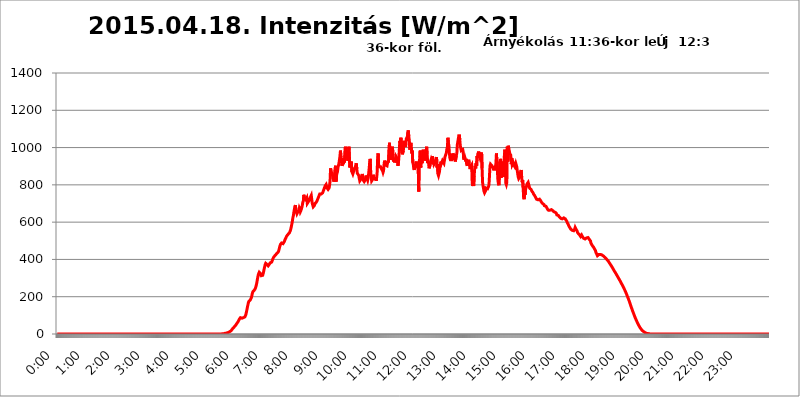
| Category | 2015.04.18. Intenzitás [W/m^2] |
|---|---|
| 0.0 | -0.256 |
| 0.0006944444444444445 | -0.256 |
| 0.001388888888888889 | -0.256 |
| 0.0020833333333333333 | -0.256 |
| 0.002777777777777778 | -0.256 |
| 0.003472222222222222 | -0.256 |
| 0.004166666666666667 | -0.256 |
| 0.004861111111111111 | -0.256 |
| 0.005555555555555556 | -0.256 |
| 0.0062499999999999995 | -0.256 |
| 0.006944444444444444 | -0.256 |
| 0.007638888888888889 | -0.256 |
| 0.008333333333333333 | -0.256 |
| 0.009027777777777779 | -0.256 |
| 0.009722222222222222 | -0.256 |
| 0.010416666666666666 | -0.256 |
| 0.011111111111111112 | -0.256 |
| 0.011805555555555555 | -0.256 |
| 0.012499999999999999 | -0.256 |
| 0.013194444444444444 | -0.256 |
| 0.013888888888888888 | -0.256 |
| 0.014583333333333332 | -0.256 |
| 0.015277777777777777 | -0.256 |
| 0.015972222222222224 | -0.256 |
| 0.016666666666666666 | -0.256 |
| 0.017361111111111112 | -0.256 |
| 0.018055555555555557 | -0.256 |
| 0.01875 | -0.256 |
| 0.019444444444444445 | -0.256 |
| 0.02013888888888889 | -0.256 |
| 0.020833333333333332 | -0.256 |
| 0.02152777777777778 | -0.256 |
| 0.022222222222222223 | -0.256 |
| 0.02291666666666667 | -0.256 |
| 0.02361111111111111 | -0.256 |
| 0.024305555555555556 | -0.256 |
| 0.024999999999999998 | -0.256 |
| 0.025694444444444447 | -0.256 |
| 0.02638888888888889 | -0.256 |
| 0.027083333333333334 | -0.256 |
| 0.027777777777777776 | -0.256 |
| 0.02847222222222222 | -0.256 |
| 0.029166666666666664 | -0.256 |
| 0.029861111111111113 | -0.256 |
| 0.030555555555555555 | -0.256 |
| 0.03125 | -0.256 |
| 0.03194444444444445 | -0.256 |
| 0.03263888888888889 | -0.256 |
| 0.03333333333333333 | -0.256 |
| 0.034027777777777775 | -0.256 |
| 0.034722222222222224 | -0.256 |
| 0.035416666666666666 | -0.256 |
| 0.036111111111111115 | -0.256 |
| 0.03680555555555556 | -0.256 |
| 0.0375 | -0.256 |
| 0.03819444444444444 | -0.256 |
| 0.03888888888888889 | -0.256 |
| 0.03958333333333333 | -0.256 |
| 0.04027777777777778 | -0.256 |
| 0.04097222222222222 | -0.256 |
| 0.041666666666666664 | -0.256 |
| 0.042361111111111106 | -0.256 |
| 0.04305555555555556 | -0.256 |
| 0.043750000000000004 | -0.256 |
| 0.044444444444444446 | -0.256 |
| 0.04513888888888889 | -0.256 |
| 0.04583333333333334 | -0.256 |
| 0.04652777777777778 | -0.256 |
| 0.04722222222222222 | -0.256 |
| 0.04791666666666666 | -0.256 |
| 0.04861111111111111 | -0.256 |
| 0.049305555555555554 | -0.256 |
| 0.049999999999999996 | -0.256 |
| 0.05069444444444445 | -0.256 |
| 0.051388888888888894 | -0.256 |
| 0.052083333333333336 | -0.256 |
| 0.05277777777777778 | -0.256 |
| 0.05347222222222222 | -0.256 |
| 0.05416666666666667 | -0.256 |
| 0.05486111111111111 | -0.256 |
| 0.05555555555555555 | -0.256 |
| 0.05625 | -0.256 |
| 0.05694444444444444 | -0.256 |
| 0.057638888888888885 | -0.256 |
| 0.05833333333333333 | -0.256 |
| 0.05902777777777778 | -0.256 |
| 0.059722222222222225 | -0.256 |
| 0.06041666666666667 | -0.256 |
| 0.061111111111111116 | -0.256 |
| 0.06180555555555556 | -0.256 |
| 0.0625 | -0.256 |
| 0.06319444444444444 | -0.256 |
| 0.06388888888888888 | -0.256 |
| 0.06458333333333334 | -0.256 |
| 0.06527777777777778 | -0.256 |
| 0.06597222222222222 | -0.256 |
| 0.06666666666666667 | -0.256 |
| 0.06736111111111111 | -0.256 |
| 0.06805555555555555 | -0.256 |
| 0.06874999999999999 | -0.256 |
| 0.06944444444444443 | -0.256 |
| 0.07013888888888889 | -0.256 |
| 0.07083333333333333 | -0.256 |
| 0.07152777777777779 | -0.256 |
| 0.07222222222222223 | -0.256 |
| 0.07291666666666667 | -0.256 |
| 0.07361111111111111 | -0.256 |
| 0.07430555555555556 | -0.256 |
| 0.075 | -0.256 |
| 0.07569444444444444 | -0.256 |
| 0.0763888888888889 | -0.256 |
| 0.07708333333333334 | -0.256 |
| 0.07777777777777778 | -0.256 |
| 0.07847222222222222 | -0.256 |
| 0.07916666666666666 | -0.256 |
| 0.0798611111111111 | -0.256 |
| 0.08055555555555556 | -0.256 |
| 0.08125 | -0.256 |
| 0.08194444444444444 | -0.256 |
| 0.08263888888888889 | -0.256 |
| 0.08333333333333333 | -0.256 |
| 0.08402777777777777 | -0.256 |
| 0.08472222222222221 | -0.256 |
| 0.08541666666666665 | -0.256 |
| 0.08611111111111112 | -0.256 |
| 0.08680555555555557 | -0.256 |
| 0.08750000000000001 | -0.256 |
| 0.08819444444444445 | -0.256 |
| 0.08888888888888889 | -0.256 |
| 0.08958333333333333 | -0.256 |
| 0.09027777777777778 | -0.256 |
| 0.09097222222222222 | -0.256 |
| 0.09166666666666667 | -0.256 |
| 0.09236111111111112 | -0.256 |
| 0.09305555555555556 | -0.256 |
| 0.09375 | -0.256 |
| 0.09444444444444444 | -0.256 |
| 0.09513888888888888 | -0.256 |
| 0.09583333333333333 | -0.256 |
| 0.09652777777777777 | -0.256 |
| 0.09722222222222222 | -0.256 |
| 0.09791666666666667 | -0.256 |
| 0.09861111111111111 | -0.256 |
| 0.09930555555555555 | -0.256 |
| 0.09999999999999999 | -0.256 |
| 0.10069444444444443 | -0.256 |
| 0.1013888888888889 | -0.256 |
| 0.10208333333333335 | -0.256 |
| 0.10277777777777779 | -0.256 |
| 0.10347222222222223 | -0.256 |
| 0.10416666666666667 | -0.256 |
| 0.10486111111111111 | -0.256 |
| 0.10555555555555556 | -0.256 |
| 0.10625 | -0.256 |
| 0.10694444444444444 | -0.256 |
| 0.1076388888888889 | -0.256 |
| 0.10833333333333334 | -0.256 |
| 0.10902777777777778 | -0.256 |
| 0.10972222222222222 | -0.256 |
| 0.1111111111111111 | -0.256 |
| 0.11180555555555556 | -0.256 |
| 0.11180555555555556 | -0.256 |
| 0.1125 | -0.256 |
| 0.11319444444444444 | -0.256 |
| 0.11388888888888889 | -0.256 |
| 0.11458333333333333 | -0.256 |
| 0.11527777777777777 | -0.256 |
| 0.11597222222222221 | -0.256 |
| 0.11666666666666665 | -0.256 |
| 0.1173611111111111 | -0.256 |
| 0.11805555555555557 | -0.256 |
| 0.11944444444444445 | -0.256 |
| 0.12013888888888889 | -0.256 |
| 0.12083333333333333 | -0.256 |
| 0.12152777777777778 | -0.256 |
| 0.12222222222222223 | -0.256 |
| 0.12291666666666667 | -0.256 |
| 0.12291666666666667 | -0.256 |
| 0.12361111111111112 | -0.256 |
| 0.12430555555555556 | -0.256 |
| 0.125 | -0.256 |
| 0.12569444444444444 | -0.256 |
| 0.12638888888888888 | -0.256 |
| 0.12708333333333333 | -0.256 |
| 0.16875 | -0.256 |
| 0.12847222222222224 | -0.256 |
| 0.12916666666666668 | -0.256 |
| 0.12986111111111112 | -0.256 |
| 0.13055555555555556 | -0.256 |
| 0.13125 | -0.256 |
| 0.13194444444444445 | -0.256 |
| 0.1326388888888889 | -0.256 |
| 0.13333333333333333 | -0.256 |
| 0.13402777777777777 | -0.256 |
| 0.13402777777777777 | -0.256 |
| 0.13472222222222222 | -0.256 |
| 0.13541666666666666 | -0.256 |
| 0.1361111111111111 | -0.256 |
| 0.13749999999999998 | -0.256 |
| 0.13819444444444443 | -0.256 |
| 0.1388888888888889 | -0.256 |
| 0.13958333333333334 | -0.256 |
| 0.14027777777777778 | -0.256 |
| 0.14097222222222222 | -0.256 |
| 0.14166666666666666 | -0.256 |
| 0.1423611111111111 | -0.256 |
| 0.14305555555555557 | -0.256 |
| 0.14375000000000002 | -0.256 |
| 0.14444444444444446 | -0.256 |
| 0.1451388888888889 | -0.256 |
| 0.1451388888888889 | -0.256 |
| 0.14652777777777778 | -0.256 |
| 0.14722222222222223 | -0.256 |
| 0.14791666666666667 | -0.256 |
| 0.1486111111111111 | -0.256 |
| 0.14930555555555555 | -0.256 |
| 0.15 | -0.256 |
| 0.15069444444444444 | -0.256 |
| 0.15138888888888888 | -0.256 |
| 0.15208333333333332 | -0.256 |
| 0.15277777777777776 | -0.256 |
| 0.15347222222222223 | -0.256 |
| 0.15416666666666667 | -0.256 |
| 0.15486111111111112 | -0.256 |
| 0.15555555555555556 | -0.256 |
| 0.15625 | -0.256 |
| 0.15694444444444444 | -0.256 |
| 0.15763888888888888 | -0.256 |
| 0.15833333333333333 | -0.256 |
| 0.15902777777777777 | -0.256 |
| 0.15972222222222224 | -0.256 |
| 0.16041666666666668 | -0.256 |
| 0.16111111111111112 | -0.256 |
| 0.16180555555555556 | -0.256 |
| 0.1625 | -0.256 |
| 0.16319444444444445 | -0.256 |
| 0.1638888888888889 | -0.256 |
| 0.16458333333333333 | -0.256 |
| 0.16527777777777777 | -0.256 |
| 0.16597222222222222 | -0.256 |
| 0.16666666666666666 | -0.256 |
| 0.1673611111111111 | -0.256 |
| 0.16805555555555554 | -0.256 |
| 0.16874999999999998 | -0.256 |
| 0.16944444444444443 | -0.256 |
| 0.17013888888888887 | -0.256 |
| 0.1708333333333333 | -0.256 |
| 0.17152777777777775 | -0.256 |
| 0.17222222222222225 | -0.256 |
| 0.1729166666666667 | -0.256 |
| 0.17361111111111113 | -0.256 |
| 0.17430555555555557 | -0.256 |
| 0.17500000000000002 | -0.256 |
| 0.17569444444444446 | -0.256 |
| 0.1763888888888889 | -0.256 |
| 0.17708333333333334 | -0.256 |
| 0.17777777777777778 | -0.256 |
| 0.17847222222222223 | -0.256 |
| 0.17916666666666667 | -0.256 |
| 0.1798611111111111 | -0.256 |
| 0.18055555555555555 | -0.256 |
| 0.18125 | -0.256 |
| 0.18194444444444444 | -0.256 |
| 0.1826388888888889 | -0.256 |
| 0.18333333333333335 | -0.256 |
| 0.1840277777777778 | -0.256 |
| 0.18472222222222223 | -0.256 |
| 0.18541666666666667 | -0.256 |
| 0.18611111111111112 | -0.256 |
| 0.18680555555555556 | -0.256 |
| 0.1875 | -0.256 |
| 0.18819444444444444 | -0.256 |
| 0.18888888888888888 | -0.256 |
| 0.18958333333333333 | -0.256 |
| 0.19027777777777777 | -0.256 |
| 0.1909722222222222 | -0.256 |
| 0.19166666666666665 | -0.256 |
| 0.19236111111111112 | -0.256 |
| 0.19305555555555554 | -0.256 |
| 0.19375 | -0.256 |
| 0.19444444444444445 | -0.256 |
| 0.1951388888888889 | -0.256 |
| 0.19583333333333333 | -0.256 |
| 0.19652777777777777 | -0.256 |
| 0.19722222222222222 | -0.256 |
| 0.19791666666666666 | -0.256 |
| 0.1986111111111111 | -0.256 |
| 0.19930555555555554 | -0.256 |
| 0.19999999999999998 | -0.256 |
| 0.20069444444444443 | -0.256 |
| 0.20138888888888887 | -0.256 |
| 0.2020833333333333 | -0.256 |
| 0.2027777777777778 | -0.256 |
| 0.2034722222222222 | -0.256 |
| 0.2041666666666667 | -0.256 |
| 0.20486111111111113 | -0.256 |
| 0.20555555555555557 | -0.256 |
| 0.20625000000000002 | -0.256 |
| 0.20694444444444446 | -0.256 |
| 0.2076388888888889 | -0.256 |
| 0.20833333333333334 | -0.256 |
| 0.20902777777777778 | -0.256 |
| 0.20972222222222223 | -0.256 |
| 0.21041666666666667 | -0.256 |
| 0.2111111111111111 | -0.256 |
| 0.21180555555555555 | -0.256 |
| 0.2125 | -0.256 |
| 0.21319444444444444 | -0.256 |
| 0.2138888888888889 | -0.256 |
| 0.21458333333333335 | -0.256 |
| 0.2152777777777778 | -0.256 |
| 0.21597222222222223 | -0.256 |
| 0.21666666666666667 | -0.256 |
| 0.21736111111111112 | -0.256 |
| 0.21805555555555556 | -0.256 |
| 0.21875 | -0.256 |
| 0.21944444444444444 | -0.256 |
| 0.22013888888888888 | -0.256 |
| 0.22083333333333333 | -0.256 |
| 0.22152777777777777 | -0.256 |
| 0.2222222222222222 | -0.256 |
| 0.22291666666666665 | -0.256 |
| 0.2236111111111111 | -0.256 |
| 0.22430555555555556 | -0.256 |
| 0.225 | -0.256 |
| 0.22569444444444445 | -0.256 |
| 0.2263888888888889 | -0.256 |
| 0.22708333333333333 | -0.256 |
| 0.22777777777777777 | -0.256 |
| 0.22847222222222222 | -0.256 |
| 0.22916666666666666 | -0.256 |
| 0.2298611111111111 | 1.09 |
| 0.23055555555555554 | 1.09 |
| 0.23124999999999998 | 1.09 |
| 0.23194444444444443 | 1.09 |
| 0.23263888888888887 | 1.09 |
| 0.2333333333333333 | 1.09 |
| 0.2340277777777778 | 2.439 |
| 0.2347222222222222 | 2.439 |
| 0.2354166666666667 | 3.791 |
| 0.23611111111111113 | 3.791 |
| 0.23680555555555557 | 5.146 |
| 0.23750000000000002 | 5.146 |
| 0.23819444444444446 | 6.503 |
| 0.2388888888888889 | 6.503 |
| 0.23958333333333334 | 7.862 |
| 0.24027777777777778 | 9.225 |
| 0.24097222222222223 | 10.589 |
| 0.24166666666666667 | 11.956 |
| 0.2423611111111111 | 13.325 |
| 0.24305555555555555 | 14.696 |
| 0.24375 | 17.444 |
| 0.24444444444444446 | 20.201 |
| 0.24513888888888888 | 24.35 |
| 0.24583333333333335 | 27.124 |
| 0.2465277777777778 | 31.297 |
| 0.24722222222222223 | 34.086 |
| 0.24791666666666667 | 36.881 |
| 0.24861111111111112 | 39.68 |
| 0.24930555555555556 | 42.483 |
| 0.25 | 45.29 |
| 0.25069444444444444 | 49.507 |
| 0.2513888888888889 | 53.73 |
| 0.2520833333333333 | 57.958 |
| 0.25277777777777777 | 62.189 |
| 0.2534722222222222 | 65.012 |
| 0.25416666666666665 | 70.658 |
| 0.2548611111111111 | 74.892 |
| 0.2555555555555556 | 80.536 |
| 0.25625000000000003 | 84.766 |
| 0.2569444444444445 | 87.583 |
| 0.2576388888888889 | 87.583 |
| 0.25833333333333336 | 86.175 |
| 0.2590277777777778 | 84.766 |
| 0.25972222222222224 | 84.766 |
| 0.2604166666666667 | 86.175 |
| 0.2611111111111111 | 87.583 |
| 0.26180555555555557 | 88.991 |
| 0.2625 | 90.399 |
| 0.26319444444444445 | 91.806 |
| 0.2638888888888889 | 96.022 |
| 0.26458333333333334 | 104.435 |
| 0.2652777777777778 | 116.989 |
| 0.2659722222222222 | 129.444 |
| 0.26666666666666666 | 143.144 |
| 0.2673611111111111 | 155.333 |
| 0.26805555555555555 | 167.374 |
| 0.26875 | 175.315 |
| 0.26944444444444443 | 180.569 |
| 0.2701388888888889 | 180.569 |
| 0.2708333333333333 | 183.184 |
| 0.27152777777777776 | 187.091 |
| 0.2722222222222222 | 194.849 |
| 0.27291666666666664 | 205.079 |
| 0.2736111111111111 | 217.681 |
| 0.2743055555555555 | 226.383 |
| 0.27499999999999997 | 231.313 |
| 0.27569444444444446 | 232.54 |
| 0.27638888888888885 | 234.99 |
| 0.27708333333333335 | 238.651 |
| 0.2777777777777778 | 244.717 |
| 0.27847222222222223 | 251.939 |
| 0.2791666666666667 | 262.666 |
| 0.2798611111111111 | 274.454 |
| 0.28055555555555556 | 289.616 |
| 0.28125 | 304.664 |
| 0.28194444444444444 | 317.371 |
| 0.2826388888888889 | 325.473 |
| 0.2833333333333333 | 331.279 |
| 0.28402777777777777 | 330.117 |
| 0.2847222222222222 | 325.473 |
| 0.28541666666666665 | 318.527 |
| 0.28611111111111115 | 312.749 |
| 0.28680555555555554 | 309.284 |
| 0.28750000000000003 | 310.439 |
| 0.2881944444444445 | 315.059 |
| 0.2888888888888889 | 325.473 |
| 0.28958333333333336 | 337.109 |
| 0.2902777777777778 | 350.049 |
| 0.29097222222222224 | 362.004 |
| 0.2916666666666667 | 372.972 |
| 0.2923611111111111 | 379.171 |
| 0.29305555555555557 | 380.42 |
| 0.29375 | 377.925 |
| 0.29444444444444445 | 371.742 |
| 0.2951388888888889 | 366.851 |
| 0.29583333333333334 | 365.635 |
| 0.2965277777777778 | 366.851 |
| 0.2972222222222222 | 372.972 |
| 0.29791666666666666 | 377.925 |
| 0.2986111111111111 | 381.674 |
| 0.29930555555555555 | 381.674 |
| 0.3 | 382.93 |
| 0.30069444444444443 | 385.455 |
| 0.3013888888888889 | 391.834 |
| 0.3020833333333333 | 399.628 |
| 0.30277777777777776 | 406.25 |
| 0.3034722222222222 | 411.638 |
| 0.30416666666666664 | 415.735 |
| 0.3048611111111111 | 418.495 |
| 0.3055555555555555 | 421.278 |
| 0.30624999999999997 | 424.085 |
| 0.3069444444444444 | 426.916 |
| 0.3076388888888889 | 431.211 |
| 0.30833333333333335 | 434.107 |
| 0.3090277777777778 | 435.566 |
| 0.30972222222222223 | 438.503 |
| 0.3104166666666667 | 444.463 |
| 0.3111111111111111 | 453.629 |
| 0.31180555555555556 | 464.688 |
| 0.3125 | 474.507 |
| 0.31319444444444444 | 481.238 |
| 0.3138888888888889 | 486.389 |
| 0.3145833333333333 | 488.126 |
| 0.31527777777777777 | 486.389 |
| 0.3159722222222222 | 484.662 |
| 0.31666666666666665 | 484.662 |
| 0.31736111111111115 | 488.126 |
| 0.31805555555555554 | 493.398 |
| 0.31875000000000003 | 498.764 |
| 0.3194444444444445 | 506.072 |
| 0.3201388888888889 | 511.671 |
| 0.32083333333333336 | 517.375 |
| 0.3215277777777778 | 523.186 |
| 0.32222222222222224 | 527.122 |
| 0.3229166666666667 | 531.108 |
| 0.3236111111111111 | 535.145 |
| 0.32430555555555557 | 537.182 |
| 0.325 | 539.234 |
| 0.32569444444444445 | 543.376 |
| 0.3263888888888889 | 549.691 |
| 0.32708333333333334 | 556.131 |
| 0.3277777777777778 | 567.15 |
| 0.3284722222222222 | 578.542 |
| 0.32916666666666666 | 592.725 |
| 0.3298611111111111 | 607.495 |
| 0.33055555555555555 | 625.508 |
| 0.33125 | 636.194 |
| 0.33194444444444443 | 655.618 |
| 0.3326388888888889 | 670.078 |
| 0.3333333333333333 | 685.046 |
| 0.3340277777777778 | 691.18 |
| 0.3347222222222222 | 661.343 |
| 0.3354166666666667 | 652.786 |
| 0.3361111111111111 | 644.405 |
| 0.3368055555555556 | 649.973 |
| 0.33749999999999997 | 655.618 |
| 0.33819444444444446 | 655.618 |
| 0.33888888888888885 | 661.343 |
| 0.33958333333333335 | 676.003 |
| 0.34027777777777773 | 670.078 |
| 0.34097222222222223 | 655.618 |
| 0.3416666666666666 | 661.343 |
| 0.3423611111111111 | 664.234 |
| 0.3430555555555555 | 678.997 |
| 0.34375 | 691.18 |
| 0.3444444444444445 | 706.89 |
| 0.3451388888888889 | 713.328 |
| 0.3458333333333334 | 746.886 |
| 0.34652777777777777 | 729.817 |
| 0.34722222222222227 | 729.817 |
| 0.34791666666666665 | 726.474 |
| 0.34861111111111115 | 719.855 |
| 0.34930555555555554 | 719.855 |
| 0.35000000000000003 | 729.817 |
| 0.3506944444444444 | 700.54 |
| 0.3513888888888889 | 697.399 |
| 0.3520833333333333 | 700.54 |
| 0.3527777777777778 | 713.328 |
| 0.3534722222222222 | 719.855 |
| 0.3541666666666667 | 726.474 |
| 0.3548611111111111 | 726.474 |
| 0.35555555555555557 | 726.474 |
| 0.35625 | 743.425 |
| 0.35694444444444445 | 723.153 |
| 0.3576388888888889 | 700.54 |
| 0.35833333333333334 | 691.18 |
| 0.3590277777777778 | 682.011 |
| 0.3597222222222222 | 682.011 |
| 0.36041666666666666 | 688.102 |
| 0.3611111111111111 | 694.278 |
| 0.36180555555555555 | 700.54 |
| 0.3625 | 700.54 |
| 0.36319444444444443 | 703.704 |
| 0.3638888888888889 | 710.098 |
| 0.3645833333333333 | 713.328 |
| 0.3652777777777778 | 723.153 |
| 0.3659722222222222 | 729.817 |
| 0.3666666666666667 | 736.574 |
| 0.3673611111111111 | 743.425 |
| 0.3680555555555556 | 750.371 |
| 0.36874999999999997 | 750.371 |
| 0.36944444444444446 | 746.886 |
| 0.37013888888888885 | 750.371 |
| 0.37083333333333335 | 750.371 |
| 0.37152777777777773 | 753.881 |
| 0.37222222222222223 | 757.414 |
| 0.3729166666666666 | 764.555 |
| 0.3736111111111111 | 771.794 |
| 0.3743055555555555 | 775.451 |
| 0.375 | 786.575 |
| 0.3756944444444445 | 794.119 |
| 0.3763888888888889 | 797.931 |
| 0.3770833333333334 | 801.768 |
| 0.37777777777777777 | 797.931 |
| 0.37847222222222227 | 782.842 |
| 0.37916666666666665 | 779.134 |
| 0.37986111111111115 | 775.451 |
| 0.38055555555555554 | 775.451 |
| 0.38125000000000003 | 782.842 |
| 0.3819444444444444 | 797.931 |
| 0.3826388888888889 | 821.353 |
| 0.3833333333333333 | 888.701 |
| 0.3840277777777778 | 875.511 |
| 0.3847222222222222 | 875.511 |
| 0.3854166666666667 | 858.335 |
| 0.3861111111111111 | 849.92 |
| 0.38680555555555557 | 837.51 |
| 0.3875 | 825.351 |
| 0.38819444444444445 | 817.382 |
| 0.3888888888888889 | 813.439 |
| 0.38958333333333334 | 821.353 |
| 0.3902777777777778 | 902.16 |
| 0.3909722222222222 | 817.382 |
| 0.39166666666666666 | 849.92 |
| 0.3923611111111111 | 862.585 |
| 0.39305555555555555 | 871.173 |
| 0.39375 | 893.157 |
| 0.39444444444444443 | 893.157 |
| 0.3951388888888889 | 915.893 |
| 0.3958333333333333 | 920.533 |
| 0.3965277777777778 | 953.892 |
| 0.3972222222222222 | 983.747 |
| 0.3979166666666667 | 949.03 |
| 0.3986111111111111 | 944.201 |
| 0.3993055555555556 | 902.16 |
| 0.39999999999999997 | 902.16 |
| 0.40069444444444446 | 920.533 |
| 0.40138888888888885 | 911.285 |
| 0.40208333333333335 | 944.201 |
| 0.40277777777777773 | 920.533 |
| 0.40347222222222223 | 925.203 |
| 0.4041666666666666 | 1004.318 |
| 0.4048611111111111 | 953.892 |
| 0.4055555555555555 | 968.671 |
| 0.40625 | 944.201 |
| 0.4069444444444445 | 953.892 |
| 0.4076388888888889 | 929.905 |
| 0.4083333333333334 | 934.639 |
| 0.40902777777777777 | 1004.318 |
| 0.40972222222222227 | 1004.318 |
| 0.41041666666666665 | 893.157 |
| 0.41111111111111115 | 897.643 |
| 0.41180555555555554 | 911.285 |
| 0.41250000000000003 | 925.203 |
| 0.4131944444444444 | 871.173 |
| 0.4138888888888889 | 871.173 |
| 0.4145833333333333 | 858.335 |
| 0.4152777777777778 | 858.335 |
| 0.4159722222222222 | 875.511 |
| 0.4166666666666667 | 879.878 |
| 0.4173611111111111 | 888.701 |
| 0.41805555555555557 | 893.157 |
| 0.41875 | 906.707 |
| 0.41944444444444445 | 915.893 |
| 0.4201388888888889 | 884.274 |
| 0.42083333333333334 | 862.585 |
| 0.4215277777777778 | 866.865 |
| 0.4222222222222222 | 862.585 |
| 0.42291666666666666 | 849.92 |
| 0.4236111111111111 | 833.43 |
| 0.42430555555555555 | 821.353 |
| 0.425 | 817.382 |
| 0.42569444444444443 | 821.353 |
| 0.4263888888888889 | 833.43 |
| 0.4270833333333333 | 837.51 |
| 0.4277777777777778 | 858.335 |
| 0.4284722222222222 | 845.755 |
| 0.4291666666666667 | 825.351 |
| 0.4298611111111111 | 821.353 |
| 0.4305555555555556 | 817.382 |
| 0.43124999999999997 | 817.382 |
| 0.43194444444444446 | 825.351 |
| 0.43263888888888885 | 833.43 |
| 0.43333333333333335 | 849.92 |
| 0.43402777777777773 | 825.351 |
| 0.43472222222222223 | 833.43 |
| 0.4354166666666666 | 825.351 |
| 0.4361111111111111 | 837.51 |
| 0.4368055555555555 | 862.585 |
| 0.4375 | 888.701 |
| 0.4381944444444445 | 920.533 |
| 0.4388888888888889 | 939.404 |
| 0.4395833333333334 | 871.173 |
| 0.44027777777777777 | 841.619 |
| 0.44097222222222227 | 821.353 |
| 0.44166666666666665 | 817.382 |
| 0.44236111111111115 | 829.377 |
| 0.44305555555555554 | 854.113 |
| 0.44375000000000003 | 841.619 |
| 0.4444444444444444 | 833.43 |
| 0.4451388888888889 | 833.43 |
| 0.4458333333333333 | 837.51 |
| 0.4465277777777778 | 833.43 |
| 0.4472222222222222 | 821.353 |
| 0.4479166666666667 | 837.51 |
| 0.4486111111111111 | 862.585 |
| 0.44930555555555557 | 934.639 |
| 0.45 | 968.671 |
| 0.45069444444444445 | 911.285 |
| 0.4513888888888889 | 897.643 |
| 0.45208333333333334 | 897.643 |
| 0.4527777777777778 | 897.643 |
| 0.4534722222222222 | 897.643 |
| 0.45416666666666666 | 893.157 |
| 0.4548611111111111 | 884.274 |
| 0.45555555555555555 | 879.878 |
| 0.45625 | 875.511 |
| 0.45694444444444443 | 866.865 |
| 0.4576388888888889 | 875.511 |
| 0.4583333333333333 | 906.707 |
| 0.4590277777777778 | 929.905 |
| 0.4597222222222222 | 925.203 |
| 0.4604166666666667 | 906.707 |
| 0.4611111111111111 | 906.707 |
| 0.4618055555555556 | 911.285 |
| 0.46249999999999997 | 902.16 |
| 0.46319444444444446 | 897.643 |
| 0.46388888888888885 | 929.905 |
| 0.46458333333333335 | 920.533 |
| 0.46527777777777773 | 920.533 |
| 0.46597222222222223 | 1025.437 |
| 0.4666666666666666 | 968.671 |
| 0.4673611111111111 | 983.747 |
| 0.4680555555555555 | 934.639 |
| 0.46875 | 973.663 |
| 0.4694444444444445 | 953.892 |
| 0.4701388888888889 | 1004.318 |
| 0.4708333333333334 | 958.785 |
| 0.47152777777777777 | 925.203 |
| 0.47222222222222227 | 939.404 |
| 0.47291666666666665 | 920.533 |
| 0.47361111111111115 | 915.893 |
| 0.47430555555555554 | 939.404 |
| 0.47500000000000003 | 953.892 |
| 0.4756944444444444 | 958.785 |
| 0.4763888888888889 | 944.201 |
| 0.4770833333333333 | 929.905 |
| 0.4777777777777778 | 902.16 |
| 0.4784722222222222 | 915.893 |
| 0.4791666666666667 | 949.03 |
| 0.4798611111111111 | 993.965 |
| 0.48055555555555557 | 1036.206 |
| 0.48125 | 1014.809 |
| 0.48194444444444445 | 1052.625 |
| 0.4826388888888889 | 993.965 |
| 0.48333333333333334 | 973.663 |
| 0.4840277777777778 | 963.712 |
| 0.4847222222222222 | 963.712 |
| 0.48541666666666666 | 983.747 |
| 0.4861111111111111 | 1036.206 |
| 0.48680555555555555 | 1009.546 |
| 0.4875 | 1004.318 |
| 0.48819444444444443 | 1009.546 |
| 0.4888888888888889 | 1009.546 |
| 0.4895833333333333 | 1047.117 |
| 0.4902777777777778 | 1052.625 |
| 0.4909722222222222 | 1036.206 |
| 0.4916666666666667 | 1080.711 |
| 0.4923611111111111 | 1092.203 |
| 0.4930555555555556 | 1058.17 |
| 0.49374999999999997 | 1041.644 |
| 0.49444444444444446 | 988.839 |
| 0.49513888888888885 | 988.839 |
| 0.49583333333333335 | 1025.437 |
| 0.49652777777777773 | 1009.546 |
| 0.49722222222222223 | 968.671 |
| 0.4979166666666666 | 983.747 |
| 0.4986111111111111 | 920.533 |
| 0.4993055555555555 | 911.285 |
| 0.5 | 888.701 |
| 0.5006944444444444 | 879.878 |
| 0.5013888888888889 | 902.16 |
| 0.5020833333333333 | 902.16 |
| 0.5027777777777778 | 911.285 |
| 0.5034722222222222 | 925.203 |
| 0.5041666666666667 | 902.16 |
| 0.5048611111111111 | 897.643 |
| 0.5055555555555555 | 893.157 |
| 0.50625 | 911.285 |
| 0.5069444444444444 | 764.555 |
| 0.5076388888888889 | 925.203 |
| 0.5083333333333333 | 939.404 |
| 0.5090277777777777 | 983.747 |
| 0.5097222222222222 | 893.157 |
| 0.5104166666666666 | 934.639 |
| 0.5111111111111112 | 925.203 |
| 0.5118055555555555 | 915.893 |
| 0.5125000000000001 | 958.785 |
| 0.5131944444444444 | 988.839 |
| 0.513888888888889 | 963.712 |
| 0.5145833333333333 | 963.712 |
| 0.5152777777777778 | 939.404 |
| 0.5159722222222222 | 929.905 |
| 0.5166666666666667 | 925.203 |
| 0.517361111111111 | 934.639 |
| 0.5180555555555556 | 1004.318 |
| 0.5187499999999999 | 963.712 |
| 0.5194444444444445 | 915.893 |
| 0.5201388888888888 | 925.203 |
| 0.5208333333333334 | 915.893 |
| 0.5215277777777778 | 888.701 |
| 0.5222222222222223 | 888.701 |
| 0.5229166666666667 | 906.707 |
| 0.5236111111111111 | 925.203 |
| 0.5243055555555556 | 934.639 |
| 0.525 | 925.203 |
| 0.5256944444444445 | 911.285 |
| 0.5263888888888889 | 953.892 |
| 0.5270833333333333 | 911.285 |
| 0.5277777777777778 | 934.639 |
| 0.5284722222222222 | 911.285 |
| 0.5291666666666667 | 911.285 |
| 0.5298611111111111 | 915.893 |
| 0.5305555555555556 | 925.203 |
| 0.53125 | 925.203 |
| 0.5319444444444444 | 949.03 |
| 0.5326388888888889 | 893.157 |
| 0.5333333333333333 | 911.285 |
| 0.5340277777777778 | 858.335 |
| 0.5347222222222222 | 849.92 |
| 0.5354166666666667 | 849.92 |
| 0.5361111111111111 | 871.173 |
| 0.5368055555555555 | 897.643 |
| 0.5375 | 902.16 |
| 0.5381944444444444 | 925.203 |
| 0.5388888888888889 | 915.893 |
| 0.5395833333333333 | 911.285 |
| 0.5402777777777777 | 929.905 |
| 0.5409722222222222 | 925.203 |
| 0.5416666666666666 | 925.203 |
| 0.5423611111111112 | 915.893 |
| 0.5430555555555555 | 911.285 |
| 0.5437500000000001 | 949.03 |
| 0.5444444444444444 | 944.201 |
| 0.545138888888889 | 949.03 |
| 0.5458333333333333 | 973.663 |
| 0.5465277777777778 | 993.965 |
| 0.5472222222222222 | 1004.318 |
| 0.5479166666666667 | 1052.625 |
| 0.548611111111111 | 1025.437 |
| 0.5493055555555556 | 1009.546 |
| 0.5499999999999999 | 968.671 |
| 0.5506944444444445 | 944.201 |
| 0.5513888888888888 | 934.639 |
| 0.5520833333333334 | 934.639 |
| 0.5527777777777778 | 934.639 |
| 0.5534722222222223 | 934.639 |
| 0.5541666666666667 | 958.785 |
| 0.5548611111111111 | 968.671 |
| 0.5555555555555556 | 953.892 |
| 0.55625 | 934.639 |
| 0.5569444444444445 | 944.201 |
| 0.5576388888888889 | 939.404 |
| 0.5583333333333333 | 925.203 |
| 0.5590277777777778 | 925.203 |
| 0.5597222222222222 | 958.785 |
| 0.5604166666666667 | 968.671 |
| 0.5611111111111111 | 1014.809 |
| 0.5618055555555556 | 1020.106 |
| 0.5625 | 1047.117 |
| 0.5631944444444444 | 1041.644 |
| 0.5638888888888889 | 1069.368 |
| 0.5645833333333333 | 1041.644 |
| 0.5652777777777778 | 1009.546 |
| 0.5659722222222222 | 1009.546 |
| 0.5666666666666667 | 983.747 |
| 0.5673611111111111 | 983.747 |
| 0.5680555555555555 | 983.747 |
| 0.56875 | 988.839 |
| 0.5694444444444444 | 973.663 |
| 0.5701388888888889 | 934.639 |
| 0.5708333333333333 | 939.404 |
| 0.5715277777777777 | 949.03 |
| 0.5722222222222222 | 939.404 |
| 0.5729166666666666 | 925.203 |
| 0.5736111111111112 | 939.404 |
| 0.5743055555555555 | 911.285 |
| 0.5750000000000001 | 902.16 |
| 0.5756944444444444 | 920.533 |
| 0.576388888888889 | 920.533 |
| 0.5770833333333333 | 934.639 |
| 0.5777777777777778 | 915.893 |
| 0.5784722222222222 | 897.643 |
| 0.5791666666666667 | 884.274 |
| 0.579861111111111 | 897.643 |
| 0.5805555555555556 | 902.16 |
| 0.5812499999999999 | 906.707 |
| 0.5819444444444445 | 813.439 |
| 0.5826388888888888 | 794.119 |
| 0.5833333333333334 | 809.522 |
| 0.5840277777777778 | 794.119 |
| 0.5847222222222223 | 845.755 |
| 0.5854166666666667 | 884.274 |
| 0.5861111111111111 | 902.16 |
| 0.5868055555555556 | 888.701 |
| 0.5875 | 915.893 |
| 0.5881944444444445 | 902.16 |
| 0.5888888888888889 | 953.892 |
| 0.5895833333333333 | 944.201 |
| 0.5902777777777778 | 968.671 |
| 0.5909722222222222 | 978.688 |
| 0.5916666666666667 | 978.688 |
| 0.5923611111111111 | 953.892 |
| 0.5930555555555556 | 944.201 |
| 0.59375 | 944.201 |
| 0.5944444444444444 | 963.712 |
| 0.5951388888888889 | 973.663 |
| 0.5958333333333333 | 888.701 |
| 0.5965277777777778 | 813.439 |
| 0.5972222222222222 | 794.119 |
| 0.5979166666666667 | 779.134 |
| 0.5986111111111111 | 764.555 |
| 0.5993055555555555 | 757.414 |
| 0.6 | 760.972 |
| 0.6006944444444444 | 768.162 |
| 0.6013888888888889 | 782.842 |
| 0.6020833333333333 | 779.134 |
| 0.6027777777777777 | 779.134 |
| 0.6034722222222222 | 779.134 |
| 0.6041666666666666 | 779.134 |
| 0.6048611111111112 | 790.334 |
| 0.6055555555555555 | 801.768 |
| 0.6062500000000001 | 849.92 |
| 0.6069444444444444 | 902.16 |
| 0.607638888888889 | 911.285 |
| 0.6083333333333333 | 915.893 |
| 0.6090277777777778 | 906.707 |
| 0.6097222222222222 | 902.16 |
| 0.6104166666666667 | 906.707 |
| 0.611111111111111 | 893.157 |
| 0.6118055555555556 | 884.274 |
| 0.6124999999999999 | 879.878 |
| 0.6131944444444445 | 884.274 |
| 0.6138888888888888 | 884.274 |
| 0.6145833333333334 | 897.643 |
| 0.6152777777777778 | 915.893 |
| 0.6159722222222223 | 968.671 |
| 0.6166666666666667 | 920.533 |
| 0.6173611111111111 | 925.203 |
| 0.6180555555555556 | 825.351 |
| 0.61875 | 805.632 |
| 0.6194444444444445 | 797.931 |
| 0.6201388888888889 | 801.768 |
| 0.6208333333333333 | 925.203 |
| 0.6215277777777778 | 939.404 |
| 0.6222222222222222 | 837.51 |
| 0.6229166666666667 | 833.43 |
| 0.6236111111111111 | 902.16 |
| 0.6243055555555556 | 925.203 |
| 0.625 | 858.335 |
| 0.6256944444444444 | 841.619 |
| 0.6263888888888889 | 915.893 |
| 0.6270833333333333 | 953.892 |
| 0.6277777777777778 | 988.839 |
| 0.6284722222222222 | 968.671 |
| 0.6291666666666667 | 809.522 |
| 0.6298611111111111 | 801.768 |
| 0.6305555555555555 | 813.439 |
| 0.63125 | 1004.318 |
| 0.6319444444444444 | 925.203 |
| 0.6326388888888889 | 1009.546 |
| 0.6333333333333333 | 993.965 |
| 0.6340277777777777 | 993.965 |
| 0.6347222222222222 | 968.671 |
| 0.6354166666666666 | 963.712 |
| 0.6361111111111112 | 958.785 |
| 0.6368055555555555 | 911.285 |
| 0.6375000000000001 | 944.201 |
| 0.6381944444444444 | 906.707 |
| 0.638888888888889 | 906.707 |
| 0.6395833333333333 | 915.893 |
| 0.6402777777777778 | 906.707 |
| 0.6409722222222222 | 906.707 |
| 0.6416666666666667 | 897.643 |
| 0.642361111111111 | 893.157 |
| 0.6430555555555556 | 915.893 |
| 0.6437499999999999 | 915.893 |
| 0.6444444444444445 | 897.643 |
| 0.6451388888888888 | 893.157 |
| 0.6458333333333334 | 858.335 |
| 0.6465277777777778 | 841.619 |
| 0.6472222222222223 | 833.43 |
| 0.6479166666666667 | 833.43 |
| 0.6486111111111111 | 841.619 |
| 0.6493055555555556 | 845.755 |
| 0.65 | 871.173 |
| 0.6506944444444445 | 879.878 |
| 0.6513888888888889 | 841.619 |
| 0.6520833333333333 | 813.439 |
| 0.6527777777777778 | 825.351 |
| 0.6534722222222222 | 782.842 |
| 0.6541666666666667 | 729.817 |
| 0.6548611111111111 | 723.153 |
| 0.6555555555555556 | 757.414 |
| 0.65625 | 746.886 |
| 0.6569444444444444 | 794.119 |
| 0.6576388888888889 | 786.575 |
| 0.6583333333333333 | 782.842 |
| 0.6590277777777778 | 805.632 |
| 0.6597222222222222 | 809.522 |
| 0.6604166666666667 | 813.439 |
| 0.6611111111111111 | 809.522 |
| 0.6618055555555555 | 794.119 |
| 0.6625 | 782.842 |
| 0.6631944444444444 | 782.842 |
| 0.6638888888888889 | 779.134 |
| 0.6645833333333333 | 775.451 |
| 0.6652777777777777 | 771.794 |
| 0.6659722222222222 | 764.555 |
| 0.6666666666666666 | 760.972 |
| 0.6673611111111111 | 757.414 |
| 0.6680555555555556 | 750.371 |
| 0.6687500000000001 | 750.371 |
| 0.6694444444444444 | 743.425 |
| 0.6701388888888888 | 739.988 |
| 0.6708333333333334 | 733.184 |
| 0.6715277777777778 | 729.817 |
| 0.6722222222222222 | 723.153 |
| 0.6729166666666666 | 719.855 |
| 0.6736111111111112 | 719.855 |
| 0.6743055555555556 | 719.855 |
| 0.6749999999999999 | 723.153 |
| 0.6756944444444444 | 723.153 |
| 0.6763888888888889 | 723.153 |
| 0.6770833333333334 | 719.855 |
| 0.6777777777777777 | 716.58 |
| 0.6784722222222223 | 713.328 |
| 0.6791666666666667 | 706.89 |
| 0.6798611111111111 | 703.704 |
| 0.6805555555555555 | 700.54 |
| 0.68125 | 700.54 |
| 0.6819444444444445 | 697.399 |
| 0.6826388888888889 | 694.278 |
| 0.6833333333333332 | 688.102 |
| 0.6840277777777778 | 688.102 |
| 0.6847222222222222 | 688.102 |
| 0.6854166666666667 | 685.046 |
| 0.686111111111111 | 682.011 |
| 0.6868055555555556 | 676.003 |
| 0.6875 | 670.078 |
| 0.6881944444444444 | 670.078 |
| 0.688888888888889 | 664.234 |
| 0.6895833333333333 | 664.234 |
| 0.6902777777777778 | 664.234 |
| 0.6909722222222222 | 664.234 |
| 0.6916666666666668 | 664.234 |
| 0.6923611111111111 | 667.146 |
| 0.6930555555555555 | 667.146 |
| 0.69375 | 664.234 |
| 0.6944444444444445 | 664.234 |
| 0.6951388888888889 | 661.343 |
| 0.6958333333333333 | 658.471 |
| 0.6965277777777777 | 655.618 |
| 0.6972222222222223 | 652.786 |
| 0.6979166666666666 | 652.786 |
| 0.6986111111111111 | 652.786 |
| 0.6993055555555556 | 649.973 |
| 0.7000000000000001 | 647.179 |
| 0.7006944444444444 | 638.912 |
| 0.7013888888888888 | 638.912 |
| 0.7020833333333334 | 638.912 |
| 0.7027777777777778 | 636.194 |
| 0.7034722222222222 | 633.495 |
| 0.7041666666666666 | 628.152 |
| 0.7048611111111112 | 625.508 |
| 0.7055555555555556 | 622.881 |
| 0.7062499999999999 | 620.273 |
| 0.7069444444444444 | 617.682 |
| 0.7076388888888889 | 615.11 |
| 0.7083333333333334 | 617.682 |
| 0.7090277777777777 | 615.11 |
| 0.7097222222222223 | 617.682 |
| 0.7104166666666667 | 622.881 |
| 0.7111111111111111 | 620.273 |
| 0.7118055555555555 | 620.273 |
| 0.7125 | 617.682 |
| 0.7131944444444445 | 615.11 |
| 0.7138888888888889 | 612.554 |
| 0.7145833333333332 | 604.992 |
| 0.7152777777777778 | 597.582 |
| 0.7159722222222222 | 592.725 |
| 0.7166666666666667 | 587.934 |
| 0.717361111111111 | 580.866 |
| 0.7180555555555556 | 576.233 |
| 0.71875 | 571.661 |
| 0.7194444444444444 | 567.15 |
| 0.720138888888889 | 562.699 |
| 0.7208333333333333 | 560.495 |
| 0.7215277777777778 | 558.305 |
| 0.7222222222222222 | 556.131 |
| 0.7229166666666668 | 556.131 |
| 0.7236111111111111 | 558.305 |
| 0.7243055555555555 | 553.97 |
| 0.725 | 553.97 |
| 0.7256944444444445 | 562.699 |
| 0.7263888888888889 | 571.661 |
| 0.7270833333333333 | 567.15 |
| 0.7277777777777777 | 560.495 |
| 0.7284722222222223 | 562.699 |
| 0.7291666666666666 | 551.823 |
| 0.7298611111111111 | 543.376 |
| 0.7305555555555556 | 539.234 |
| 0.7312500000000001 | 537.182 |
| 0.7319444444444444 | 537.182 |
| 0.7326388888888888 | 531.108 |
| 0.7333333333333334 | 527.122 |
| 0.7340277777777778 | 523.186 |
| 0.7347222222222222 | 523.186 |
| 0.7354166666666666 | 531.108 |
| 0.7361111111111112 | 529.108 |
| 0.7368055555555556 | 521.237 |
| 0.7374999999999999 | 519.3 |
| 0.7381944444444444 | 513.561 |
| 0.7388888888888889 | 511.671 |
| 0.7395833333333334 | 513.561 |
| 0.7402777777777777 | 509.793 |
| 0.7409722222222223 | 509.793 |
| 0.7416666666666667 | 511.671 |
| 0.7423611111111111 | 515.462 |
| 0.7430555555555555 | 515.462 |
| 0.74375 | 517.375 |
| 0.7444444444444445 | 517.375 |
| 0.7451388888888889 | 517.375 |
| 0.7458333333333332 | 513.561 |
| 0.7465277777777778 | 506.072 |
| 0.7472222222222222 | 504.229 |
| 0.7479166666666667 | 498.764 |
| 0.748611111111111 | 486.389 |
| 0.7493055555555556 | 486.389 |
| 0.75 | 482.945 |
| 0.7506944444444444 | 472.848 |
| 0.751388888888889 | 472.848 |
| 0.7520833333333333 | 466.302 |
| 0.7527777777777778 | 461.486 |
| 0.7534722222222222 | 456.747 |
| 0.7541666666666668 | 452.082 |
| 0.7548611111111111 | 447.487 |
| 0.7555555555555555 | 437.031 |
| 0.75625 | 434.107 |
| 0.7569444444444445 | 434.107 |
| 0.7576388888888889 | 419.883 |
| 0.7583333333333333 | 415.735 |
| 0.7590277777777777 | 421.278 |
| 0.7597222222222223 | 426.916 |
| 0.7604166666666666 | 426.916 |
| 0.7611111111111111 | 426.916 |
| 0.7618055555555556 | 426.916 |
| 0.7625000000000001 | 425.497 |
| 0.7631944444444444 | 425.497 |
| 0.7638888888888888 | 424.085 |
| 0.7645833333333334 | 424.085 |
| 0.7652777777777778 | 422.678 |
| 0.7659722222222222 | 418.495 |
| 0.7666666666666666 | 415.735 |
| 0.7673611111111112 | 412.998 |
| 0.7680555555555556 | 411.638 |
| 0.7687499999999999 | 408.934 |
| 0.7694444444444444 | 406.25 |
| 0.7701388888888889 | 403.587 |
| 0.7708333333333334 | 399.628 |
| 0.7715277777777777 | 397.012 |
| 0.7722222222222223 | 394.415 |
| 0.7729166666666667 | 390.55 |
| 0.7736111111111111 | 386.723 |
| 0.7743055555555555 | 381.674 |
| 0.775 | 377.925 |
| 0.7756944444444445 | 374.206 |
| 0.7763888888888889 | 369.291 |
| 0.7770833333333332 | 365.635 |
| 0.7777777777777778 | 360.798 |
| 0.7784722222222222 | 357.196 |
| 0.7791666666666667 | 352.423 |
| 0.779861111111111 | 347.682 |
| 0.7805555555555556 | 342.968 |
| 0.78125 | 338.278 |
| 0.7819444444444444 | 334.774 |
| 0.782638888888889 | 330.117 |
| 0.7833333333333333 | 325.473 |
| 0.7840277777777778 | 320.84 |
| 0.7847222222222222 | 316.215 |
| 0.7854166666666668 | 311.594 |
| 0.7861111111111111 | 306.974 |
| 0.7868055555555555 | 302.353 |
| 0.7875 | 297.728 |
| 0.7881944444444445 | 293.096 |
| 0.7888888888888889 | 288.455 |
| 0.7895833333333333 | 283.803 |
| 0.7902777777777777 | 277.967 |
| 0.7909722222222223 | 273.281 |
| 0.7916666666666666 | 268.576 |
| 0.7923611111111111 | 263.851 |
| 0.7930555555555556 | 259.104 |
| 0.7937500000000001 | 253.137 |
| 0.7944444444444444 | 248.335 |
| 0.7951388888888888 | 242.296 |
| 0.7958333333333334 | 237.433 |
| 0.7965277777777778 | 231.313 |
| 0.7972222222222222 | 226.383 |
| 0.7979166666666666 | 218.93 |
| 0.7986111111111112 | 212.664 |
| 0.7993055555555556 | 205.079 |
| 0.7999999999999999 | 198.701 |
| 0.8006944444444444 | 192.271 |
| 0.8013888888888889 | 184.488 |
| 0.8020833333333334 | 177.946 |
| 0.8027777777777777 | 170.029 |
| 0.8034722222222223 | 162.042 |
| 0.8041666666666667 | 153.986 |
| 0.8048611111111111 | 145.865 |
| 0.8055555555555555 | 139.051 |
| 0.80625 | 132.196 |
| 0.8069444444444445 | 123.922 |
| 0.8076388888888889 | 116.989 |
| 0.8083333333333332 | 110.025 |
| 0.8090277777777778 | 103.035 |
| 0.8097222222222222 | 96.022 |
| 0.8104166666666667 | 88.991 |
| 0.811111111111111 | 83.356 |
| 0.8118055555555556 | 76.304 |
| 0.8125 | 70.658 |
| 0.8131944444444444 | 65.012 |
| 0.813888888888889 | 59.368 |
| 0.8145833333333333 | 53.73 |
| 0.8152777777777778 | 48.1 |
| 0.8159722222222222 | 43.886 |
| 0.8166666666666668 | 39.68 |
| 0.8173611111111111 | 34.086 |
| 0.8180555555555555 | 31.297 |
| 0.81875 | 27.124 |
| 0.8194444444444445 | 24.35 |
| 0.8201388888888889 | 20.201 |
| 0.8208333333333333 | 17.444 |
| 0.8215277777777777 | 16.069 |
| 0.8222222222222223 | 13.325 |
| 0.8229166666666666 | 11.956 |
| 0.8236111111111111 | 9.225 |
| 0.8243055555555556 | 7.862 |
| 0.8250000000000001 | 6.503 |
| 0.8256944444444444 | 5.146 |
| 0.8263888888888888 | 3.791 |
| 0.8270833333333334 | 3.791 |
| 0.8277777777777778 | 2.439 |
| 0.8284722222222222 | 2.439 |
| 0.8291666666666666 | 1.09 |
| 0.8298611111111112 | 1.09 |
| 0.8305555555555556 | 1.09 |
| 0.8312499999999999 | -0.256 |
| 0.8319444444444444 | -0.256 |
| 0.8326388888888889 | -0.256 |
| 0.8333333333333334 | -0.256 |
| 0.8340277777777777 | -0.256 |
| 0.8347222222222223 | -0.256 |
| 0.8354166666666667 | -0.256 |
| 0.8361111111111111 | -0.256 |
| 0.8368055555555555 | -0.256 |
| 0.8375 | -0.256 |
| 0.8381944444444445 | -0.256 |
| 0.8388888888888889 | -0.256 |
| 0.8395833333333332 | -0.256 |
| 0.8402777777777778 | -0.256 |
| 0.8409722222222222 | -0.256 |
| 0.8416666666666667 | -0.256 |
| 0.842361111111111 | -0.256 |
| 0.8430555555555556 | -0.256 |
| 0.84375 | -0.256 |
| 0.8444444444444444 | -0.256 |
| 0.845138888888889 | -0.256 |
| 0.8458333333333333 | -0.256 |
| 0.8465277777777778 | -0.256 |
| 0.8472222222222222 | -0.256 |
| 0.8479166666666668 | -0.256 |
| 0.8486111111111111 | -0.256 |
| 0.8493055555555555 | -0.256 |
| 0.85 | -0.256 |
| 0.8506944444444445 | -0.256 |
| 0.8513888888888889 | -0.256 |
| 0.8520833333333333 | -0.256 |
| 0.8527777777777777 | -0.256 |
| 0.8534722222222223 | -0.256 |
| 0.8541666666666666 | -0.256 |
| 0.8548611111111111 | -0.256 |
| 0.8555555555555556 | -0.256 |
| 0.8562500000000001 | -0.256 |
| 0.8569444444444444 | -0.256 |
| 0.8576388888888888 | -0.256 |
| 0.8583333333333334 | -0.256 |
| 0.8590277777777778 | -0.256 |
| 0.8597222222222222 | -0.256 |
| 0.8604166666666666 | -0.256 |
| 0.8611111111111112 | -0.256 |
| 0.8618055555555556 | -0.256 |
| 0.8624999999999999 | -0.256 |
| 0.8631944444444444 | -0.256 |
| 0.8638888888888889 | -0.256 |
| 0.8645833333333334 | -0.256 |
| 0.8652777777777777 | -0.256 |
| 0.8659722222222223 | -0.256 |
| 0.8666666666666667 | -0.256 |
| 0.8673611111111111 | -0.256 |
| 0.8680555555555555 | -0.256 |
| 0.86875 | -0.256 |
| 0.8694444444444445 | -0.256 |
| 0.8701388888888889 | -0.256 |
| 0.8708333333333332 | -0.256 |
| 0.8715277777777778 | -0.256 |
| 0.8722222222222222 | -0.256 |
| 0.8729166666666667 | -0.256 |
| 0.873611111111111 | -0.256 |
| 0.8743055555555556 | -0.256 |
| 0.875 | -0.256 |
| 0.8756944444444444 | -0.256 |
| 0.876388888888889 | -0.256 |
| 0.8770833333333333 | -0.256 |
| 0.8777777777777778 | -0.256 |
| 0.8784722222222222 | -0.256 |
| 0.8791666666666668 | -0.256 |
| 0.8798611111111111 | -0.256 |
| 0.8805555555555555 | -0.256 |
| 0.88125 | -0.256 |
| 0.8819444444444445 | -0.256 |
| 0.8826388888888889 | -0.256 |
| 0.8833333333333333 | -0.256 |
| 0.8840277777777777 | -0.256 |
| 0.8847222222222223 | -0.256 |
| 0.8854166666666666 | -0.256 |
| 0.8861111111111111 | -0.256 |
| 0.8868055555555556 | -0.256 |
| 0.8875000000000001 | -0.256 |
| 0.8881944444444444 | -0.256 |
| 0.8888888888888888 | -0.256 |
| 0.8895833333333334 | -0.256 |
| 0.8902777777777778 | -0.256 |
| 0.8909722222222222 | -0.256 |
| 0.8916666666666666 | -0.256 |
| 0.8923611111111112 | -0.256 |
| 0.8930555555555556 | -0.256 |
| 0.8937499999999999 | -0.256 |
| 0.8944444444444444 | -0.256 |
| 0.8951388888888889 | -0.256 |
| 0.8958333333333334 | -0.256 |
| 0.8965277777777777 | -0.256 |
| 0.8972222222222223 | -0.256 |
| 0.8979166666666667 | -0.256 |
| 0.8986111111111111 | -0.256 |
| 0.8993055555555555 | -0.256 |
| 0.9 | -0.256 |
| 0.9006944444444445 | -0.256 |
| 0.9013888888888889 | -0.256 |
| 0.9020833333333332 | -0.256 |
| 0.9027777777777778 | -0.256 |
| 0.9034722222222222 | -0.256 |
| 0.9041666666666667 | -0.256 |
| 0.904861111111111 | -0.256 |
| 0.9055555555555556 | -0.256 |
| 0.90625 | -0.256 |
| 0.9069444444444444 | -0.256 |
| 0.907638888888889 | -0.256 |
| 0.9083333333333333 | -0.256 |
| 0.9090277777777778 | -0.256 |
| 0.9097222222222222 | -0.256 |
| 0.9104166666666668 | -0.256 |
| 0.9111111111111111 | -0.256 |
| 0.9118055555555555 | -0.256 |
| 0.9125 | -0.256 |
| 0.9131944444444445 | -0.256 |
| 0.9138888888888889 | -0.256 |
| 0.9145833333333333 | -0.256 |
| 0.9152777777777777 | -0.256 |
| 0.9159722222222223 | -0.256 |
| 0.9166666666666666 | -0.256 |
| 0.9173611111111111 | -0.256 |
| 0.9180555555555556 | -0.256 |
| 0.9187500000000001 | -0.256 |
| 0.9194444444444444 | -0.256 |
| 0.9201388888888888 | -0.256 |
| 0.9208333333333334 | -0.256 |
| 0.9215277777777778 | -0.256 |
| 0.9222222222222222 | -0.256 |
| 0.9229166666666666 | -0.256 |
| 0.9236111111111112 | -0.256 |
| 0.9243055555555556 | -0.256 |
| 0.9249999999999999 | -0.256 |
| 0.9256944444444444 | -0.256 |
| 0.9263888888888889 | -0.256 |
| 0.9270833333333334 | -0.256 |
| 0.9277777777777777 | -0.256 |
| 0.9284722222222223 | -0.256 |
| 0.9291666666666667 | -0.256 |
| 0.9298611111111111 | -0.256 |
| 0.9305555555555555 | -0.256 |
| 0.93125 | -0.256 |
| 0.9319444444444445 | -0.256 |
| 0.9326388888888889 | -0.256 |
| 0.9333333333333332 | -0.256 |
| 0.9340277777777778 | -0.256 |
| 0.9347222222222222 | -0.256 |
| 0.9354166666666667 | -0.256 |
| 0.936111111111111 | -0.256 |
| 0.9368055555555556 | -0.256 |
| 0.9375 | -0.256 |
| 0.9381944444444444 | -0.256 |
| 0.938888888888889 | -0.256 |
| 0.9395833333333333 | -0.256 |
| 0.9402777777777778 | -0.256 |
| 0.9409722222222222 | -0.256 |
| 0.9416666666666668 | -0.256 |
| 0.9423611111111111 | -0.256 |
| 0.9430555555555555 | -0.256 |
| 0.94375 | -0.256 |
| 0.9444444444444445 | -0.256 |
| 0.9451388888888889 | -0.256 |
| 0.9458333333333333 | -0.256 |
| 0.9465277777777777 | -0.256 |
| 0.9472222222222223 | -0.256 |
| 0.9479166666666666 | -0.256 |
| 0.9486111111111111 | -0.256 |
| 0.9493055555555556 | -0.256 |
| 0.9500000000000001 | -0.256 |
| 0.9506944444444444 | -0.256 |
| 0.9513888888888888 | -0.256 |
| 0.9520833333333334 | -0.256 |
| 0.9527777777777778 | -0.256 |
| 0.9534722222222222 | -0.256 |
| 0.9541666666666666 | -0.256 |
| 0.9548611111111112 | -0.256 |
| 0.9555555555555556 | -0.256 |
| 0.9562499999999999 | -0.256 |
| 0.9569444444444444 | -0.256 |
| 0.9576388888888889 | -0.256 |
| 0.9583333333333334 | -0.256 |
| 0.9590277777777777 | -0.256 |
| 0.9597222222222223 | -0.256 |
| 0.9604166666666667 | -0.256 |
| 0.9611111111111111 | -0.256 |
| 0.9618055555555555 | -0.256 |
| 0.9625 | -0.256 |
| 0.9631944444444445 | -0.256 |
| 0.9638888888888889 | -0.256 |
| 0.9645833333333332 | -0.256 |
| 0.9652777777777778 | -0.256 |
| 0.9659722222222222 | -0.256 |
| 0.9666666666666667 | -0.256 |
| 0.967361111111111 | -0.256 |
| 0.9680555555555556 | -0.256 |
| 0.96875 | -0.256 |
| 0.9694444444444444 | -0.256 |
| 0.970138888888889 | -0.256 |
| 0.9708333333333333 | -0.256 |
| 0.9715277777777778 | -0.256 |
| 0.9722222222222222 | -0.256 |
| 0.9729166666666668 | -0.256 |
| 0.9736111111111111 | -0.256 |
| 0.9743055555555555 | -0.256 |
| 0.975 | -0.256 |
| 0.9756944444444445 | -0.256 |
| 0.9763888888888889 | -0.256 |
| 0.9770833333333333 | -0.256 |
| 0.9777777777777777 | -0.256 |
| 0.9784722222222223 | -0.256 |
| 0.9791666666666666 | -0.256 |
| 0.9798611111111111 | -0.256 |
| 0.9805555555555556 | -0.256 |
| 0.9812500000000001 | -0.256 |
| 0.9819444444444444 | -0.256 |
| 0.9826388888888888 | -0.256 |
| 0.9833333333333334 | -0.256 |
| 0.9840277777777778 | -0.256 |
| 0.9847222222222222 | -0.256 |
| 0.9854166666666666 | -0.256 |
| 0.9861111111111112 | -0.256 |
| 0.9868055555555556 | -0.256 |
| 0.9874999999999999 | -0.256 |
| 0.9881944444444444 | -0.256 |
| 0.9888888888888889 | -0.256 |
| 0.9895833333333334 | -0.256 |
| 0.9902777777777777 | -0.256 |
| 0.9909722222222223 | -0.256 |
| 0.9916666666666667 | -0.256 |
| 0.9923611111111111 | -0.256 |
| 0.9930555555555555 | -0.256 |
| 0.99375 | -0.256 |
| 0.9944444444444445 | -0.256 |
| 0.9951388888888889 | -0.256 |
| 0.9958333333333332 | -0.256 |
| 0.9965277777777778 | -0.256 |
| 0.9972222222222222 | -0.256 |
| 0.9979166666666667 | -0.256 |
| 0.998611111111111 | -0.256 |
| 0.9993055555555556 | 0 |